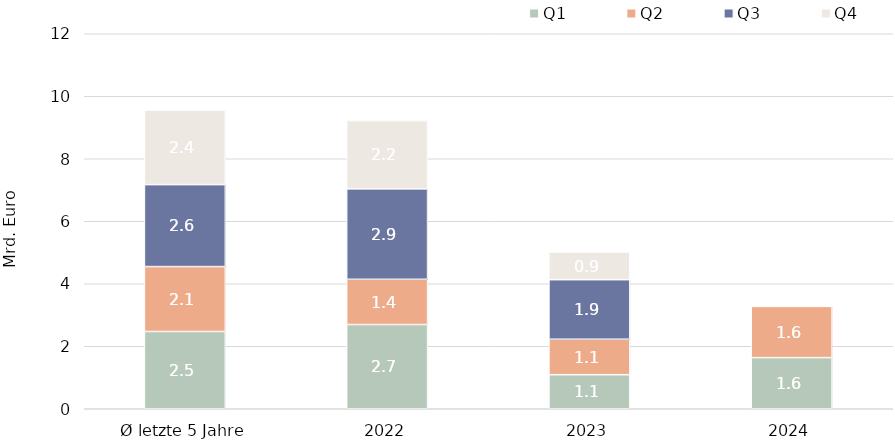
| Category | Q1 | Q2 | Q3 | Q4 |
|---|---|---|---|---|
| Ø letzte 5 Jahre | 2472435371.6 | 2077545286.94 | 2622535716.024 | 2384745346.318 |
| 2022 | 2695170195.57 | 1447397830.99 | 2894255899.38 | 2183546723 |
| 2023 | 1089552950 | 1134957048.99 | 1905749413.3 | 886112513 |
| 2024 | 1637089070 | 1638815458 | 0 | 0 |